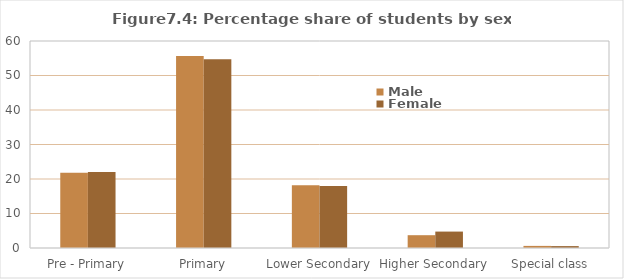
| Category | Male | Female |
|---|---|---|
| Pre - Primary | 21.827 | 22.001 |
| Primary | 55.657 | 54.733 |
| Lower Secondary | 18.194 | 17.955 |
| Higher Secondary | 3.712 | 4.76 |
| Special class | 0.61 | 0.551 |